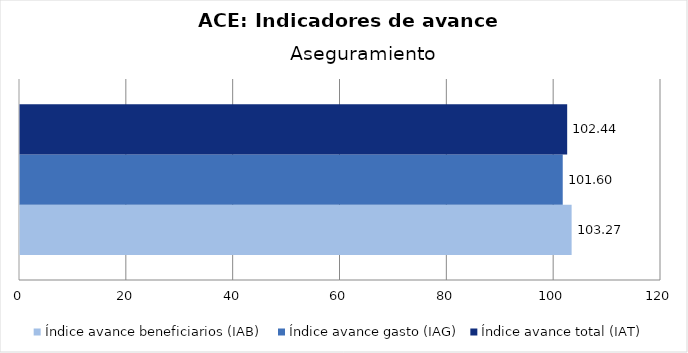
| Category | Índice avance beneficiarios (IAB)  | Índice avance gasto (IAG) | Índice avance total (IAT)  |
|---|---|---|---|
| Aseguramiento | 103.268 | 101.603 | 102.436 |